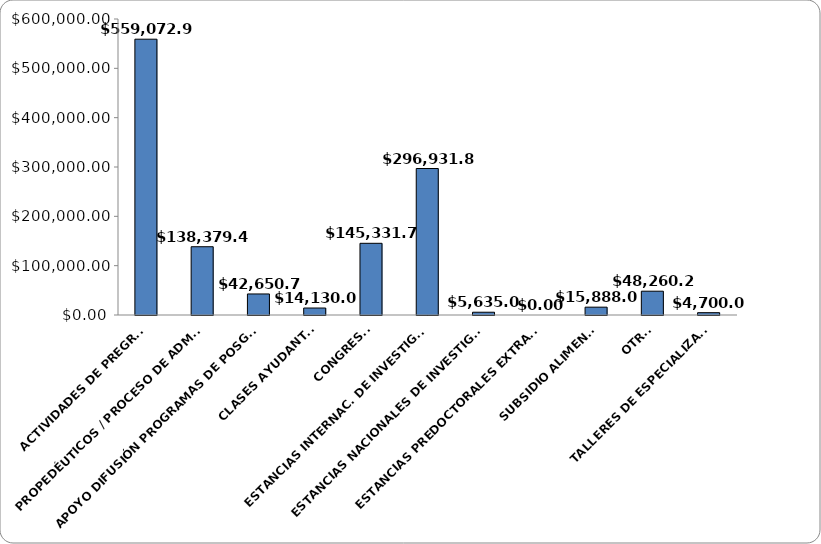
| Category | Series 0 |
|---|---|
| ACTIVIDADES DE PREGRADO | 559072.95 |
| PROPEDÉUTICOS / PROCESO DE ADMISIÓN | 138379.48 |
| APOYO DIFUSIÓN PROGRAMAS DE POSGRADO | 42650.78 |
| CLASES AYUDANTÍAS | 14130 |
| CONGRESOS | 145331.79 |
| ESTANCIAS INTERNAC. DE INVESTIGACIÓN | 296931.8 |
| ESTANCIAS NACIONALES DE INVESTIGACIÓN | 5635 |
| ESTANCIAS PREDOCTORALES EXTRANJERO | 0 |
| SUBSIDIO ALIMENTOS | 15888 |
| OTROS | 48260.2 |
| TALLERES DE ESPECIALIZACIÓN | 4700 |